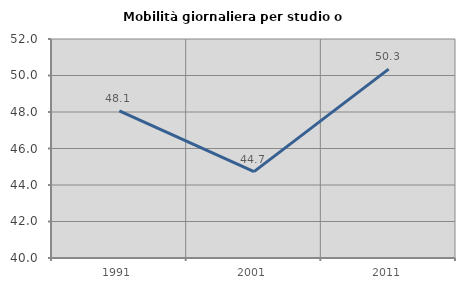
| Category | Mobilità giornaliera per studio o lavoro |
|---|---|
| 1991.0 | 48.058 |
| 2001.0 | 44.73 |
| 2011.0 | 50.348 |